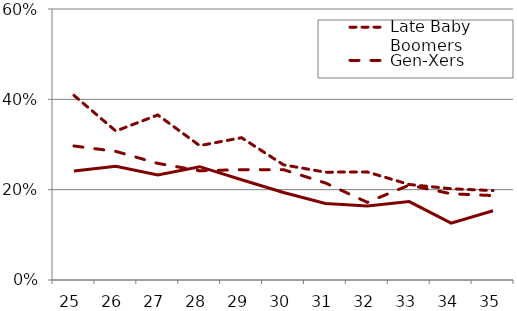
| Category | Late Baby Boomers | Gen-Xers | Millennials |
|---|---|---|---|
| 25.0 | 0.409 | 0.297 | 0.242 |
| 26.0 | 0.33 | 0.285 | 0.252 |
| 27.0 | 0.365 | 0.258 | 0.232 |
| 28.0 | 0.298 | 0.242 | 0.251 |
| 29.0 | 0.315 | 0.244 | 0.222 |
| 30.0 | 0.255 | 0.244 | 0.194 |
| 31.0 | 0.239 | 0.215 | 0.17 |
| 32.0 | 0.239 | 0.172 | 0.164 |
| 33.0 | 0.211 | 0.21 | 0.174 |
| 34.0 | 0.202 | 0.191 | 0.126 |
| 35.0 | 0.198 | 0.187 | 0.153 |